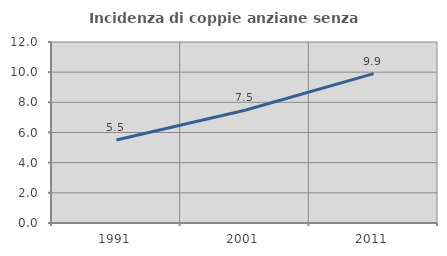
| Category | Incidenza di coppie anziane senza figli  |
|---|---|
| 1991.0 | 5.498 |
| 2001.0 | 7.473 |
| 2011.0 | 9.903 |